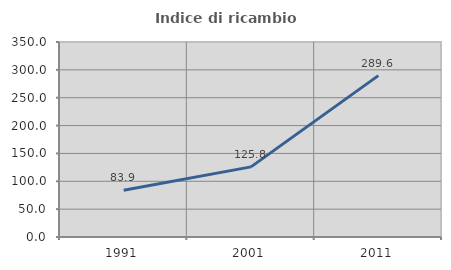
| Category | Indice di ricambio occupazionale  |
|---|---|
| 1991.0 | 83.898 |
| 2001.0 | 125.83 |
| 2011.0 | 289.617 |